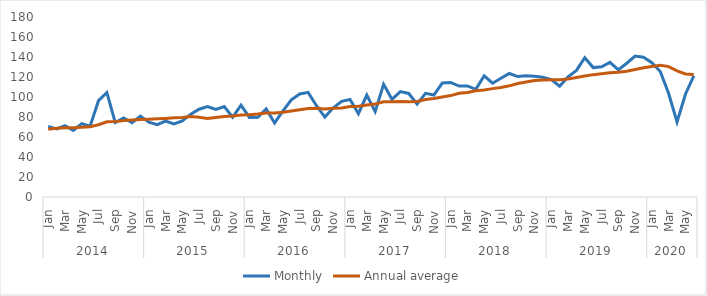
| Category | Monthly | Annual average |
|---|---|---|
| 0 | 70.677 | 67.643 |
| 1 | 68.059 | 68.683 |
| 2 | 71.261 | 69.278 |
| 3 | 66.507 | 69.237 |
| 4 | 73.414 | 69.675 |
| 5 | 70.835 | 70.272 |
| 6 | 96.314 | 72.315 |
| 7 | 104.46 | 75.188 |
| 8 | 74.459 | 75.375 |
| 9 | 79.096 | 76.377 |
| 10 | 74.297 | 76.993 |
| 11 | 80.87 | 77.521 |
| 12 | 74.827 | 77.866 |
| 13 | 72.399 | 78.228 |
| 14 | 75.938 | 78.618 |
| 15 | 73.145 | 79.171 |
| 16 | 76.042 | 79.39 |
| 17 | 82.803 | 80.388 |
| 18 | 87.763 | 79.675 |
| 19 | 90.343 | 78.498 |
| 20 | 87.562 | 79.59 |
| 21 | 90.532 | 80.543 |
| 22 | 79.77 | 80.999 |
| 23 | 91.811 | 81.911 |
| 24 | 79.566 | 82.306 |
| 25 | 79.699 | 82.915 |
| 26 | 88.034 | 83.922 |
| 27 | 74.047 | 83.998 |
| 28 | 86.193 | 84.843 |
| 29 | 97.186 | 86.042 |
| 30 | 102.989 | 87.311 |
| 31 | 104.663 | 88.504 |
| 32 | 91.312 | 88.817 |
| 33 | 79.952 | 87.935 |
| 34 | 89.137 | 88.716 |
| 35 | 95.667 | 89.037 |
| 36 | 97.461 | 90.528 |
| 37 | 83.276 | 90.826 |
| 38 | 101.97 | 91.988 |
| 39 | 85.42 | 92.935 |
| 40 | 112.676 | 95.142 |
| 41 | 97.697 | 95.185 |
| 42 | 105.375 | 95.384 |
| 43 | 103.549 | 95.291 |
| 44 | 92.906 | 95.424 |
| 45 | 103.694 | 97.402 |
| 46 | 102.006 | 98.475 |
| 47 | 113.97 | 100 |
| 48 | 114.546 | 101.424 |
| 49 | 110.919 | 103.727 |
| 50 | 111.041 | 104.483 |
| 51 | 107.605 | 106.332 |
| 52 | 121.186 | 107.041 |
| 53 | 113.788 | 108.382 |
| 54 | 118.755 | 109.497 |
| 55 | 123.521 | 111.161 |
| 56 | 120.415 | 113.454 |
| 57 | 121.214 | 114.914 |
| 58 | 120.728 | 116.474 |
| 59 | 119.775 | 116.958 |
| 60 | 117.425 | 117.198 |
| 61 | 110.849 | 117.192 |
| 62 | 120.23 | 117.958 |
| 63 | 126.62 | 119.542 |
| 64 | 139.338 | 121.055 |
| 65 | 129.417 | 122.357 |
| 66 | 130.134 | 123.306 |
| 67 | 134.581 | 124.227 |
| 68 | 127.099 | 124.784 |
| 69 | 133.761 | 125.83 |
| 70 | 140.999 | 127.519 |
| 71 | 139.769 | 129.185 |
| 72 | 134.344 | 130.595 |
| 73 | 125.485 | 131.815 |
| 74 | 103.546 | 130.424 |
| 75 | 75.037 | 126.126 |
| 76 | 102.769 | 123.078 |
| 77 | 121.185 | 122.392 |